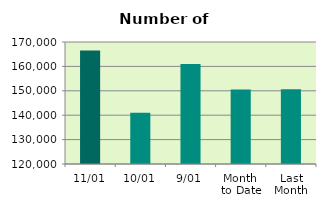
| Category | Series 0 |
|---|---|
| 11/01 | 166552 |
| 10/01 | 140968 |
| 9/01 | 160994 |
| Month 
to Date | 150529.5 |
| Last
Month | 150628.737 |